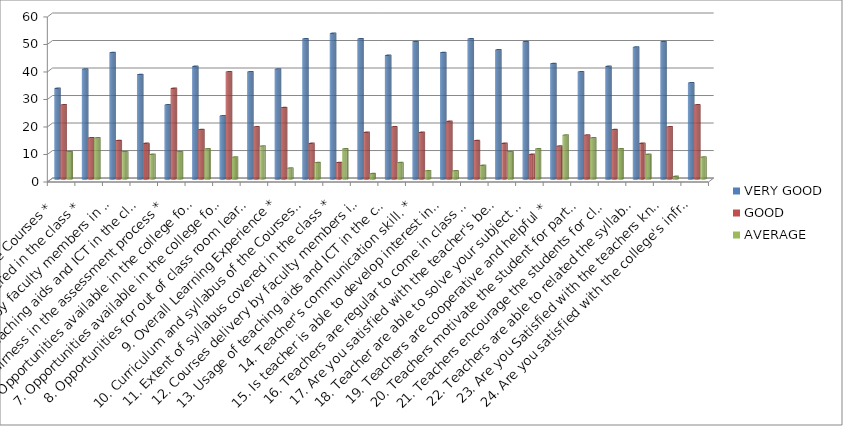
| Category | VERY GOOD | GOOD | AVERAGE |
|---|---|---|---|
| 1. Curriculum and syllabus of the Courses * | 33 | 27 | 10 |
| 2. Extent of syllabus covered in the class * | 40 | 15 | 15 |
| 3. Courses delivery by faculty members in the class * | 46 | 14 | 10 |
| 4. Usage of teaching aids and ICT in the class | 38 | 13 | 9 |
| 5. fairness in the assessment process * | 27 | 33 | 10 |
| 6. Opportunities available in the college for best practices / other activities * | 41 | 18 | 11 |
| 7. Opportunities available in the college for students to participate in internship, field visits etc. * | 23 | 39 | 8 |
| 8. Opportunities for out of class room learning eg. Guest lectures, Seminars, Workshop Value aided Programmes, Conferences, competitions etc. * | 39 | 19 | 12 |
| 9. Overall Learning Experience * | 40 | 26 | 4 |
| 10. Curriculum and syllabus of the Courses * | 51 | 13 | 6 |
| 11. Extent of syllabus covered in the class * | 53 | 6 | 11 |
| 12. Courses delivery by faculty members in the class * | 51 | 17 | 2 |
| 13. Usage of teaching aids and ICT in the class * | 45 | 19 | 6 |
| 14. Teacher's communication skill. * | 50 | 17 | 3 |
| 15. Is teacher is able to develop interest in teaching process * | 46 | 21 | 3 |
| 16. Teachers are regular to come in class on time * | 51 | 14 | 5 |
| 17. Are you satisfied with the teacher's behavior * | 47 | 13 | 10 |
| 18. Teacher are able to solve your subject related queries * | 50 | 9 | 11 |
| 19. Teachers are cooperative and helpful * | 42 | 12 | 16 |
| 20. Teachers motivate the student for participation in other curricular activities * | 39 | 16 | 15 |
| 21. Teachers encourage the students for classroom activities * | 41 | 18 | 11 |
| 22. Teachers are able to related the syllabus with real life/Social circle. * | 48 | 13 | 9 |
| 23. Are you Satisfied with the teachers knowledge * | 50 | 19 | 1 |
| 24. Are you satisfied with the college's infrastructure and environment : * | 35 | 27 | 8 |